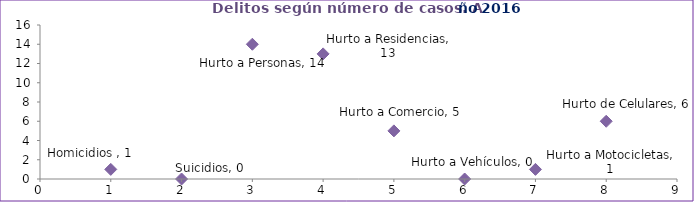
| Category | Series 0 |
|---|---|
| 0 | 1 |
| 1 | 0 |
| 2 | 14 |
| 3 | 13 |
| 4 | 5 |
| 5 | 0 |
| 6 | 1 |
| 7 | 6 |